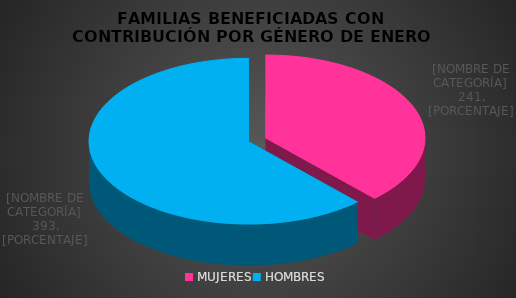
| Category | NUMERO DE FAMILIAS |
|---|---|
| MUJERES | 241 |
| HOMBRES | 393 |